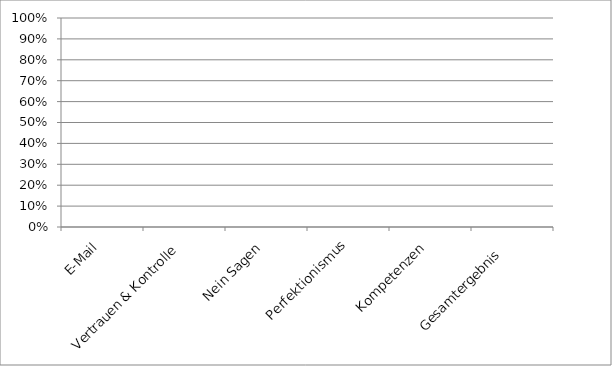
| Category | Series 0 |
|---|---|
| E-Mail | 0 |
| Vertrauen & Kontrolle | 0 |
| Nein Sagen | 0 |
| Perfektionismus | 0 |
| Kompetenzen | 0 |
| Gesamtergebnis   | 0 |